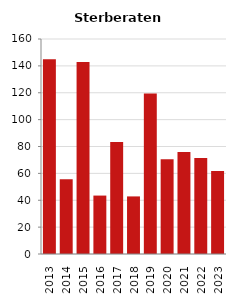
| Category | Sterberate der Bevölkerung ab 80 Jahre (auf Tsd.) |
|---|---|
| 2013.0 | 144.928 |
| 2014.0 | 55.556 |
| 2015.0 | 142.857 |
| 2016.0 | 43.478 |
| 2017.0 | 83.333 |
| 2018.0 | 42.857 |
| 2019.0 | 119.403 |
| 2020.0 | 70.423 |
| 2021.0 | 75.949 |
| 2022.0 | 71.429 |
| 2023.0 | 61.728 |